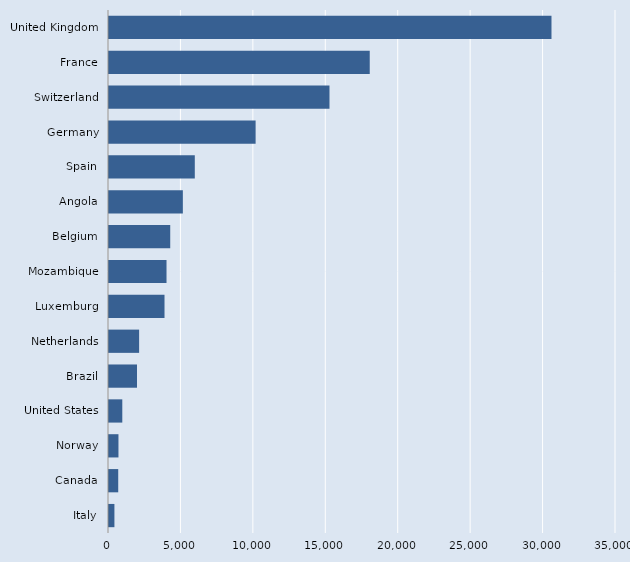
| Category | Series 0 |
|---|---|
| Italy | 374 |
| Canada | 637 |
| Norway | 653 |
| United States | 918 |
| Brazil | 1934 |
| Netherlands | 2079 |
| Luxemburg | 3832 |
| Mozambique | 3971 |
| Belgium | 4227 |
| Angola | 5098 |
| Spain | 5923 |
| Germany | 10121 |
| Switzerland | 15221 |
| France | 18000 |
| United Kingdom | 30546 |